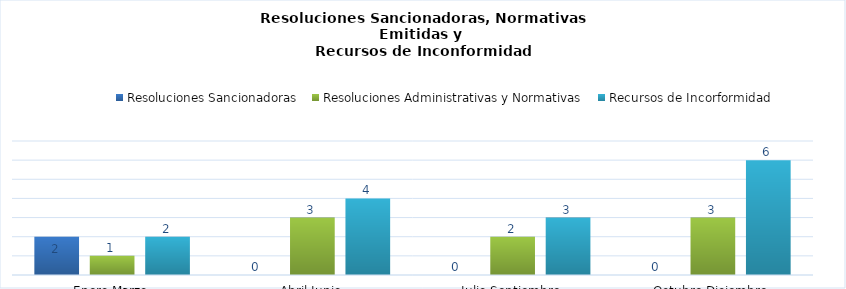
| Category | Resoluciones Sancionadoras | Resoluciones Administrativas y Normativas | Recursos de Incorformidad |
|---|---|---|---|
| Enero-Marzo | 2 | 1 | 2 |
| Abril-Junio | 0 | 3 | 4 |
| Julio-Septiembre | 0 | 2 | 3 |
| Octubre-Diciembre | 0 | 3 | 6 |